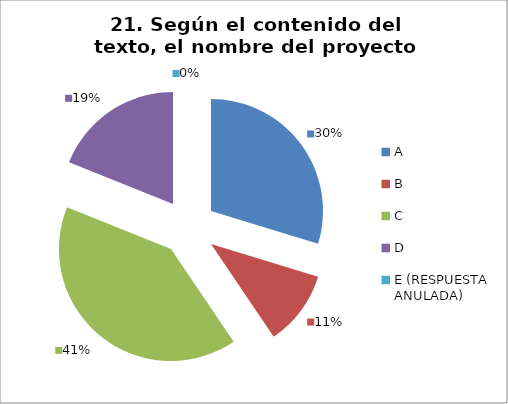
| Category | CANTIDAD DE RESPUESTAS PREGUNTA (21) | PORCENTAJE |
|---|---|---|
| A | 11 | 0.297 |
| B | 4 | 0.108 |
| C | 15 | 0.405 |
| D | 7 | 0.189 |
| E (RESPUESTA ANULADA) | 0 | 0 |